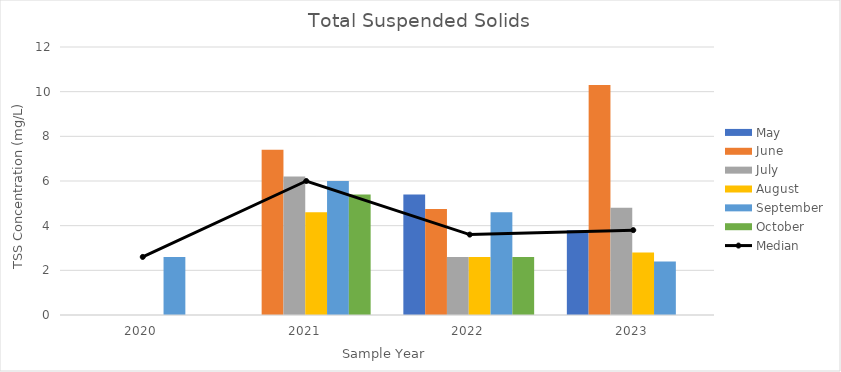
| Category | May | June | July | August | September | October |
|---|---|---|---|---|---|---|
| 2020.0 | 0 | 0 | 0 | 0 | 2.6 | 0 |
| 2021.0 | 0 | 7.4 | 6.2 | 4.6 | 6 | 5.4 |
| 2022.0 | 5.4 | 4.75 | 2.6 | 2.6 | 4.6 | 2.6 |
| 2023.0 | 3.8 | 10.3 | 4.8 | 2.8 | 2.4 | 0 |